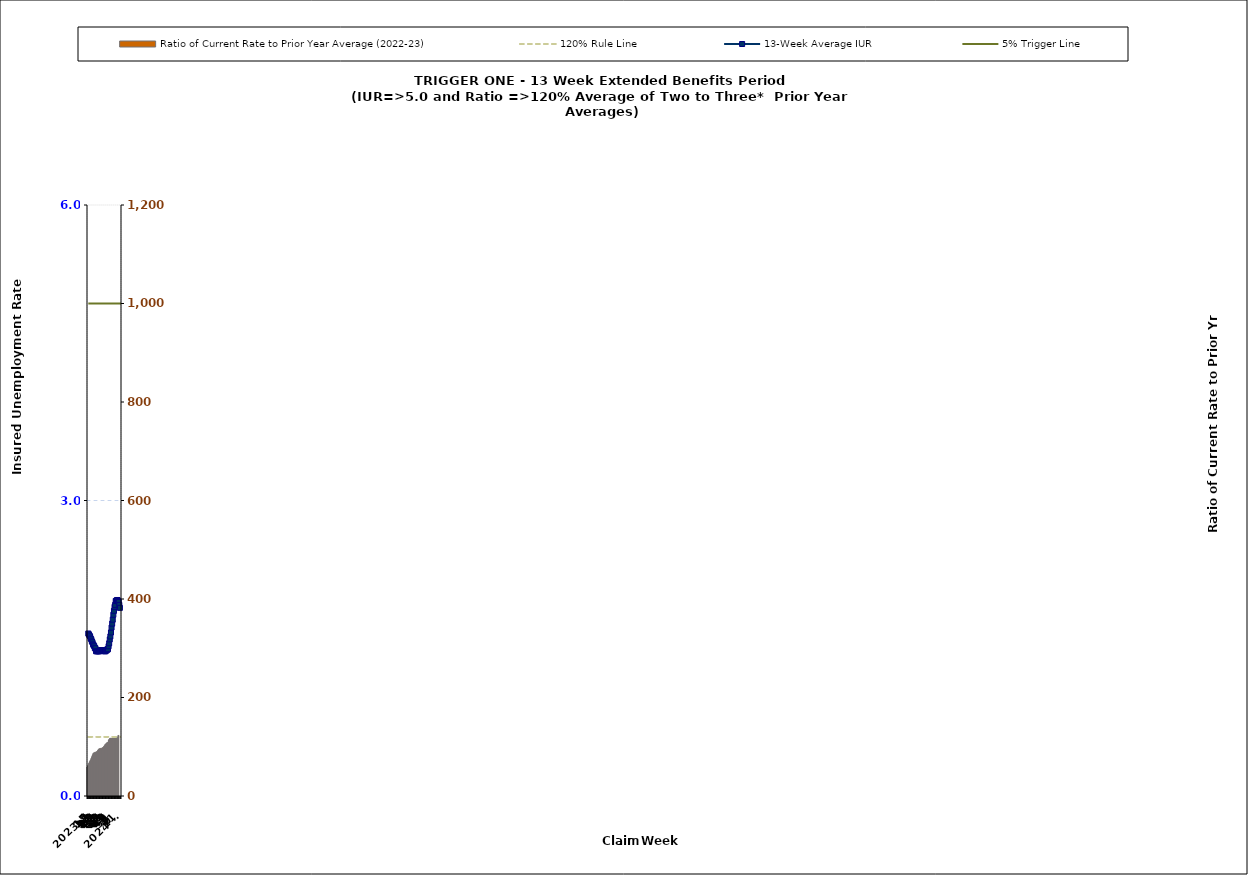
| Category | Ratio of Current Rate to Prior Year Average (2022-23) |
|---|---|
| 2023-13 | 58.82 |
| 14 | 61.19 |
| 15 | 63.79 |
| 16 | 66.8 |
| 17 | 69.41 |
| 18 | 71.78 |
| 19 | 73.7 |
| 20 | 77.22 |
| 21 | 80 |
| 22 | 83.37 |
| 23 | 86.11 |
| 24 | 87.2 |
| 25 | 88.75 |
| 26 | 87.5 |
| 27 | 88.82 |
| 28 | 89.63 |
| 29 | 90.18 |
| 30 | 90.74 |
| 31 | 93.03 |
| 32 | 94.53 |
| 33 | 95.79 |
| 34 | 96.1 |
| 35 | 97.04 |
| 36 | 96.1 |
| 37 | 96.41 |
| 38 | 97.68 |
| 39 | 98.33 |
| 40 | 98.98 |
| 41 | 100.68 |
| 42 | 102.08 |
| 43 | 104.22 |
| 44 | 105.71 |
| 45 | 106.81 |
| 46 | 107.97 |
| 47 | 108.57 |
| 48 | 109.54 |
| 49 | 113.57 |
| 50 | 115.71 |
| 51 | 116.9 |
| 52 | 117.52 |
| 1 | 117.44 |
| 2 | 116.99 |
| 3 | 117.94 |
| 4 | 117.86 |
| 5 | 118.15 |
| 6 | 118.29 |
| 7 | 118.2 |
| 8 | 117.85 |
| 9 | 118.45 |
| 10 | 118.8 |
| 11 | 118.91 |
| 12 | 119.75 |
| 2024-13 | 122.78 |
| 2024-14 | 123.22 |